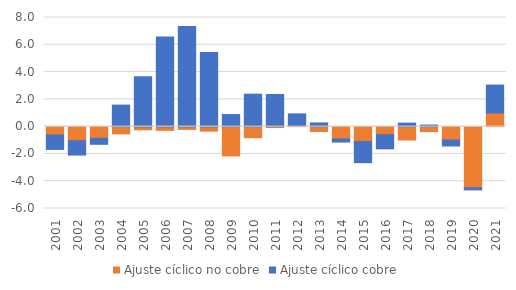
| Category | Ajuste cíclico no cobre | Ajuste cíclico cobre |
|---|---|---|
| 2001.0 | -0.61 | -1.059 |
| 2002.0 | -1.029 | -1.055 |
| 2003.0 | -0.854 | -0.441 |
| 2004.0 | -0.53 | 1.579 |
| 2005.0 | -0.23 | 3.657 |
| 2006.0 | -0.27 | 6.562 |
| 2007.0 | -0.202 | 7.331 |
| 2008.0 | -0.33 | 5.43 |
| 2009.0 | -2.146 | 0.887 |
| 2010.0 | -0.807 | 2.379 |
| 2011.0 | -0.067 | 2.356 |
| 2012.0 | 0.071 | 0.864 |
| 2013.0 | -0.357 | 0.275 |
| 2014.0 | -0.903 | -0.228 |
| 2015.0 | -1.089 | -1.551 |
| 2016.0 | -0.59 | -1.039 |
| 2017.0 | -0.979 | 0.259 |
| 2018.0 | -0.364 | 0.115 |
| 2019.0 | -0.973 | -0.446 |
| 2020.0 | -4.482 | -0.156 |
| 2021.0 | 0.997 | 2.053 |